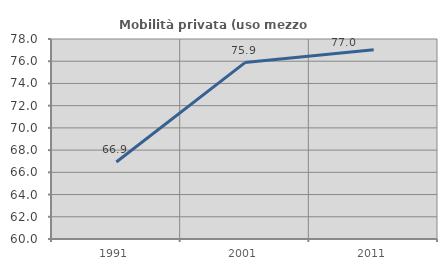
| Category | Mobilità privata (uso mezzo privato) |
|---|---|
| 1991.0 | 66.931 |
| 2001.0 | 75.875 |
| 2011.0 | 77.023 |